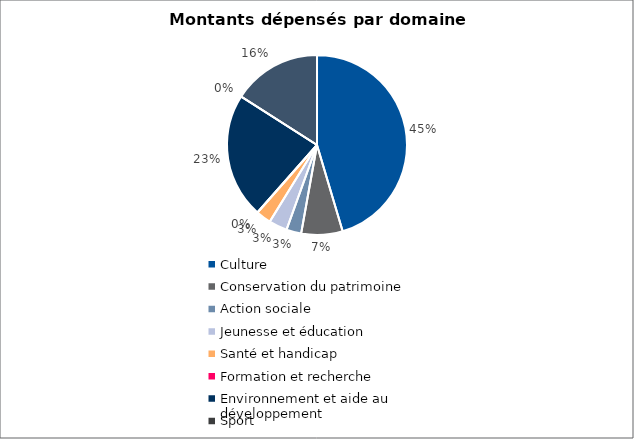
| Category | Series 0 |
|---|---|
| Culture | 3491700 |
| Conservation du patrimoine | 571500 |
| Action sociale | 205200 |
| Jeunesse et éducation | 254000 |
| Santé et handicap | 208500 |
| Formation et recherche | 0 |
| Environnement et aide au
développement | 1734000 |
| Sport | 0 |
| Autres projets d’utilité publique | 1227065 |